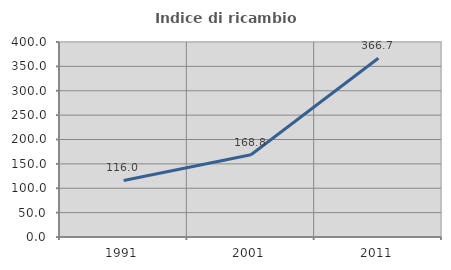
| Category | Indice di ricambio occupazionale  |
|---|---|
| 1991.0 | 116 |
| 2001.0 | 168.75 |
| 2011.0 | 366.667 |